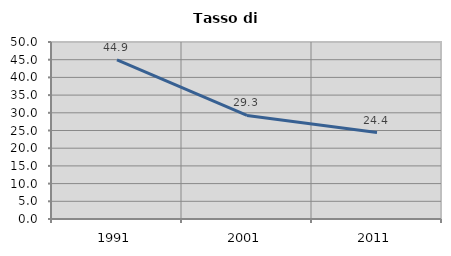
| Category | Tasso di disoccupazione   |
|---|---|
| 1991.0 | 44.938 |
| 2001.0 | 29.265 |
| 2011.0 | 24.424 |